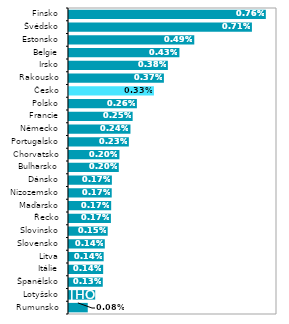
| Category | Series 0 |
|---|---|
| Rumunsko | 0.001 |
| Lotyšsko | 0.001 |
| Španělsko | 0.001 |
| Itálie | 0.001 |
| Litva | 0.001 |
| Slovensko | 0.001 |
| Slovinsko | 0.002 |
| Řecko | 0.002 |
| Maďarsko | 0.002 |
| Nizozemsko | 0.002 |
| Dánsko | 0.002 |
| Bulharsko | 0.002 |
| Chorvatsko | 0.002 |
| Portugalsko | 0.002 |
| Německo | 0.002 |
| Francie | 0.002 |
| Polsko | 0.003 |
| Česko | 0.003 |
| Rakousko | 0.004 |
| Irsko | 0.004 |
| Belgie | 0.004 |
| Estonsko | 0.005 |
| Švédsko | 0.007 |
| Finsko | 0.008 |